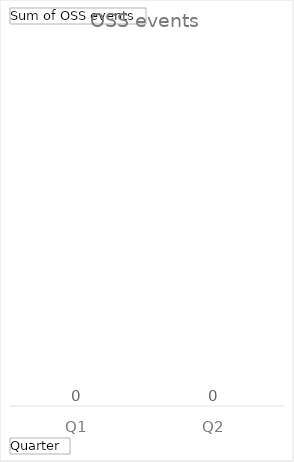
| Category | Total |
|---|---|
| Q1 | 0 |
| Q2 | 0 |